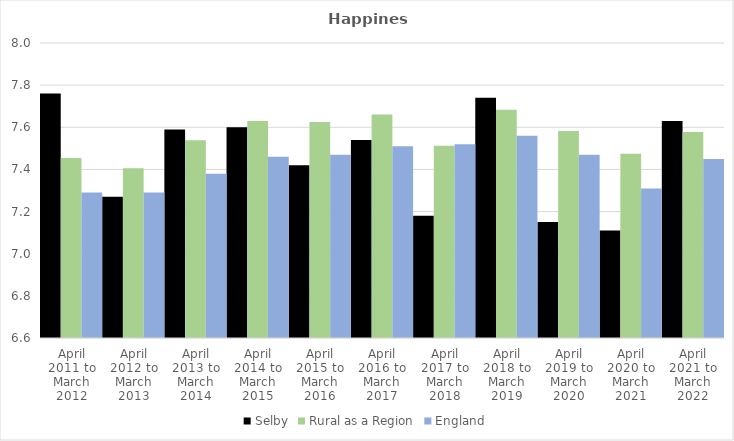
| Category | Selby | Rural as a Region | England |
|---|---|---|---|
| April 2011 to March 2012 | 7.76 | 7.454 | 7.29 |
| April 2012 to March 2013 | 7.27 | 7.406 | 7.29 |
| April 2013 to March 2014 | 7.59 | 7.539 | 7.38 |
| April 2014 to March 2015 | 7.6 | 7.63 | 7.46 |
| April 2015 to March 2016 | 7.42 | 7.625 | 7.47 |
| April 2016 to March 2017 | 7.54 | 7.661 | 7.51 |
| April 2017 to March 2018 | 7.18 | 7.513 | 7.52 |
| April 2018 to March 2019 | 7.74 | 7.684 | 7.56 |
| April 2019 to March 2020 | 7.15 | 7.582 | 7.47 |
| April 2020 to March 2021 | 7.11 | 7.474 | 7.31 |
| April 2021 to March 2022 | 7.63 | 7.577 | 7.45 |